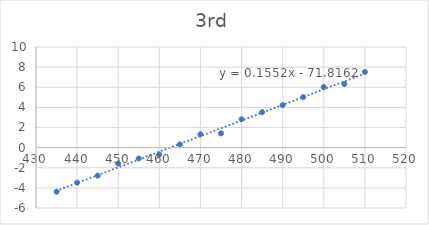
| Category | Series 0 |
|---|---|
| 435.0 | -4.38 |
| 440.0 | -3.48 |
| 445.0 | -2.78 |
| 450.0 | -1.58 |
| 455.0 | -1.08 |
| 460.0 | -0.68 |
| 465.0 | 0.32 |
| 470.0 | 1.32 |
| 475.0 | 1.42 |
| 480.0 | 2.82 |
| 485.0 | 3.52 |
| 490.0 | 4.22 |
| 495.0 | 5.02 |
| 500.0 | 6.02 |
| 505.0 | 6.32 |
| 510.0 | 7.52 |